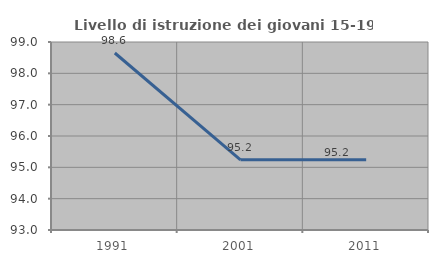
| Category | Livello di istruzione dei giovani 15-19 anni |
|---|---|
| 1991.0 | 98.649 |
| 2001.0 | 95.238 |
| 2011.0 | 95.238 |